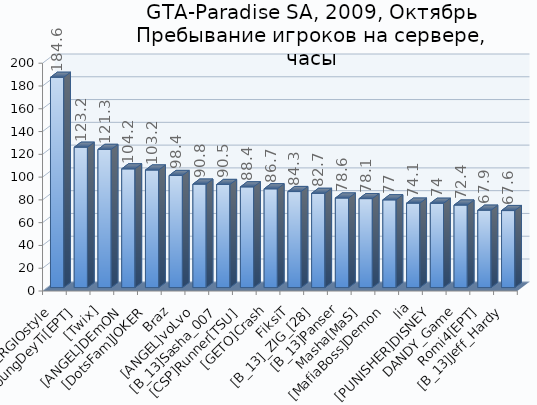
| Category | Series 0 |
|---|---|
| SERGIOstyle | 184.6 |
| YoungDeyTi[EPT] | 123.2 |
| [Twix] | 121.3 |
| [ANGEL]DEmON | 104.2 |
| [DotsFam]JOKER | 103.2 |
| Braz | 98.4 |
| [ANGEL]voLvo | 90.8 |
| [B_13]Sasha_007 | 90.5 |
| [CSP]Runner[TSU] | 88.4 |
| [GETO]Crash | 86.7 |
| FiksiT | 84.3 |
| [B_13]_ZIG_[28] | 82.7 |
| [B_13]Panser | 78.6 |
| Masha[MaS] | 78.1 |
| [MafiaBoss]Demon | 77 |
| lia | 74.1 |
| [PUNISHER]DISNEY | 74 |
| DANDY_Game | 72.4 |
| Romi4[EPT] | 67.9 |
| [B_13]Jeff_Hardy | 67.6 |